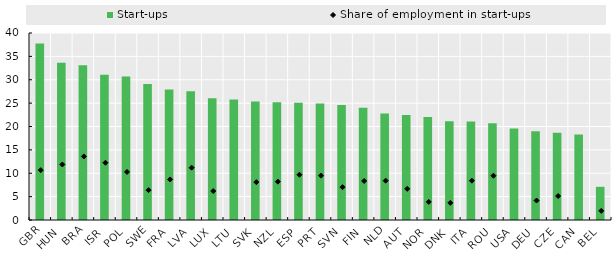
| Category | Start-ups |
|---|---|
| GBR | 37.762 |
| HUN | 33.623 |
| BRA | 33.084 |
| ISR | 31.046 |
| POL | 30.711 |
| SWE | 29.064 |
| FRA | 27.933 |
| LVA | 27.553 |
| LUX | 26.045 |
| LTU | 25.77 |
| SVK | 25.323 |
| NZL | 25.183 |
| ESP | 25.093 |
| PRT | 24.942 |
| SVN | 24.612 |
| FIN | 24.007 |
| NLD | 22.794 |
| AUT | 22.463 |
| NOR | 22.017 |
| DNK | 21.117 |
| ITA | 21.05 |
| ROU | 20.707 |
| USA | 19.583 |
| DEU | 18.996 |
| CZE | 18.678 |
| CAN | 18.31 |
| BEL | 7.097 |